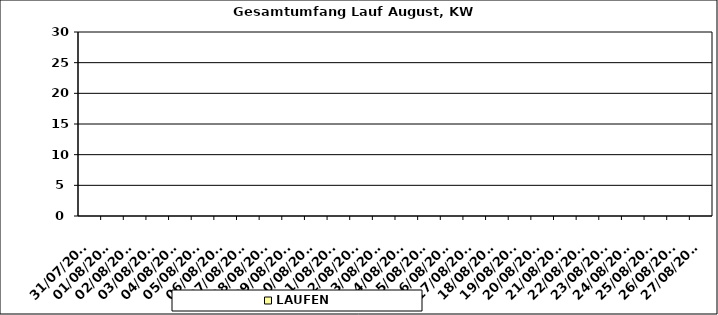
| Category | LAUFEN |
|---|---|
| 31/07/2023 | 0 |
| 01/08/2023 | 0 |
| 02/08/2023 | 0 |
| 03/08/2023 | 0 |
| 04/08/2023 | 0 |
| 05/08/2023 | 0 |
| 06/08/2023 | 0 |
| 07/08/2023 | 0 |
| 08/08/2023 | 0 |
| 09/08/2023 | 0 |
| 10/08/2023 | 0 |
| 11/08/2023 | 0 |
| 12/08/2023 | 0 |
| 13/08/2023 | 0 |
| 14/08/2023 | 0 |
| 15/08/2023 | 0 |
| 16/08/2023 | 0 |
| 17/08/2023 | 0 |
| 18/08/2023 | 0 |
| 19/08/2023 | 0 |
| 20/08/2023 | 0 |
| 21/08/2023 | 0 |
| 22/08/2023 | 0 |
| 23/08/2023 | 0 |
| 24/08/2023 | 0 |
| 25/08/2023 | 0 |
| 26/08/2023 | 0 |
| 27/08/2023 | 0 |